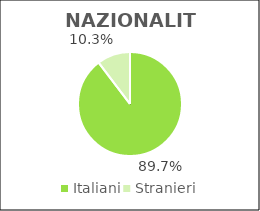
| Category | Series 0 |
|---|---|
| Italiani | 63273 |
| Stranieri | 7288 |